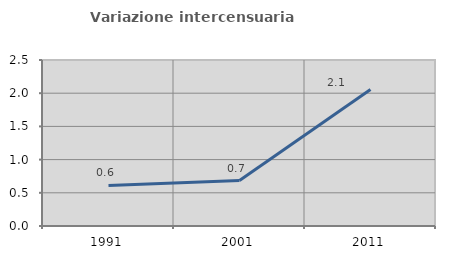
| Category | Variazione intercensuaria annua |
|---|---|
| 1991.0 | 0.611 |
| 2001.0 | 0.685 |
| 2011.0 | 2.055 |